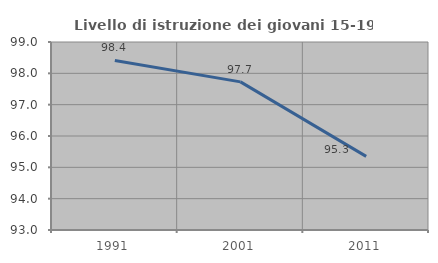
| Category | Livello di istruzione dei giovani 15-19 anni |
|---|---|
| 1991.0 | 98.413 |
| 2001.0 | 97.727 |
| 2011.0 | 95.349 |